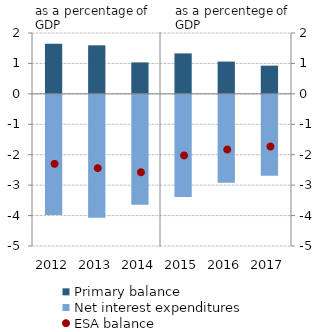
| Category | Primary balance |
|---|---|
| 2012.0 | 1.644 |
| 2013.0 | 1.595 |
| 2014.0 | 1.033 |
| 2015.0 | 1.329 |
| 2016.0 | 1.061 |
| 2017.0 | 0.927 |